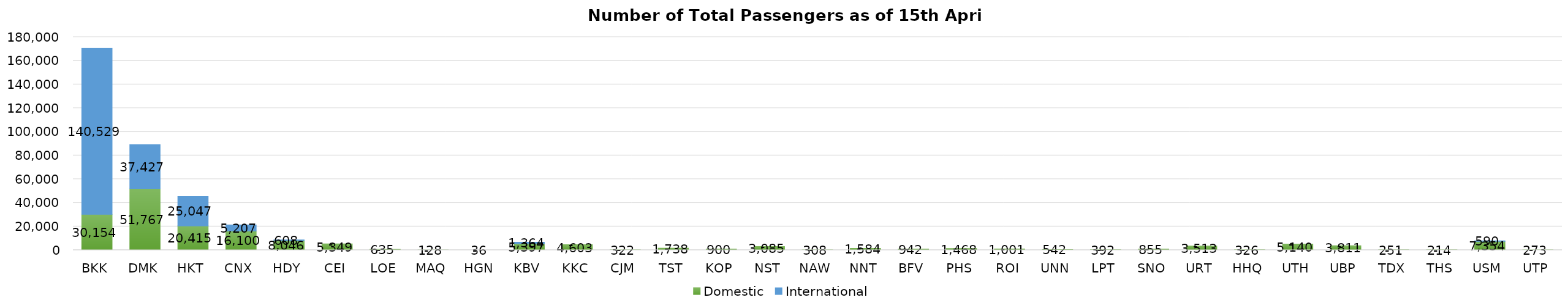
| Category | Domestic | International |
|---|---|---|
| BKK | 30154 | 140529 |
| DMK | 51767 | 37427 |
| HKT | 20415 | 25047 |
| CNX | 16100 | 5207 |
| HDY | 8046 | 608 |
| CEI | 5349 | 0 |
| LOE | 635 | 0 |
| MAQ | 128 | 0 |
| HGN | 36 | 0 |
| KBV | 5397 | 1364 |
| KKC | 4603 | 0 |
| CJM | 322 | 0 |
| TST | 1738 | 0 |
| KOP | 900 | 0 |
| NST | 3085 | 0 |
| NAW | 308 | 0 |
| NNT | 1584 | 0 |
| BFV | 942 | 0 |
| PHS | 1468 | 0 |
| ROI | 1001 | 0 |
| UNN | 542 | 0 |
| LPT | 392 | 0 |
| SNO | 855 | 0 |
| URT | 3513 | 0 |
| HHQ | 326 | 0 |
| UTH | 5140 | 0 |
| UBP | 3811 | 0 |
| TDX | 251 | 0 |
| THS | 214 | 0 |
| USM | 7354 | 590 |
| UTP | 273 | 0 |